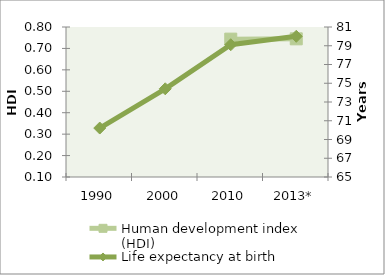
| Category | Human development index (HDI) |
|---|---|
| 1990 | 0 |
| 2000 | 0 |
| 2010 | 0.743 |
| 2013* | 0.745 |